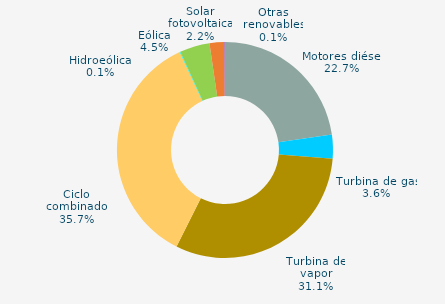
| Category | Series 0 |
|---|---|
| Motores diésel | 22.7 |
| Turbina de gas | 3.6 |
| Turbina de vapor | 31.1 |
| Ciclo combinado | 35.7 |
| Cogeneración | 0 |
| Hidráulica | 0 |
| Hidroeólica | 0.1 |
| Eólica | 4.5 |
| Solar fotovoltaica | 2.2 |
| Otras renovables | 0.1 |